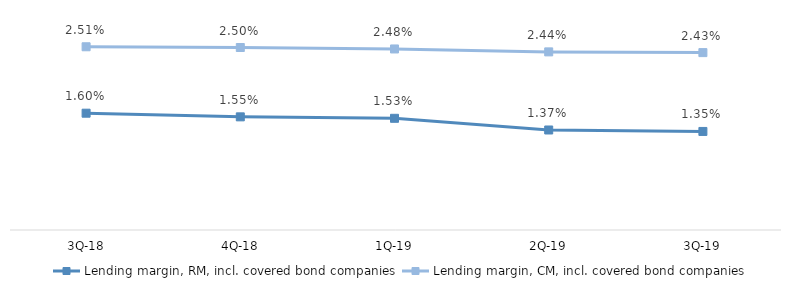
| Category | Lending margin, RM, incl. covered bond companies | Lending margin, CM, incl. covered bond companies |
|---|---|---|
| 3Q-19 | 0.014 | 0.024 |
| 2Q-19 | 0.014 | 0.024 |
| 1Q-19 | 0.015 | 0.025 |
| 4Q-18 | 0.016 | 0.025 |
| 3Q-18 | 0.016 | 0.025 |